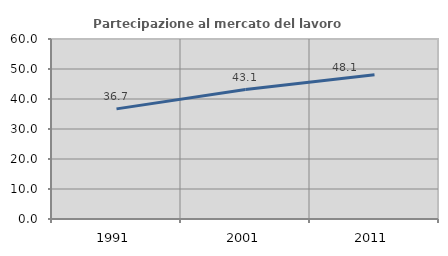
| Category | Partecipazione al mercato del lavoro  femminile |
|---|---|
| 1991.0 | 36.703 |
| 2001.0 | 43.134 |
| 2011.0 | 48.106 |